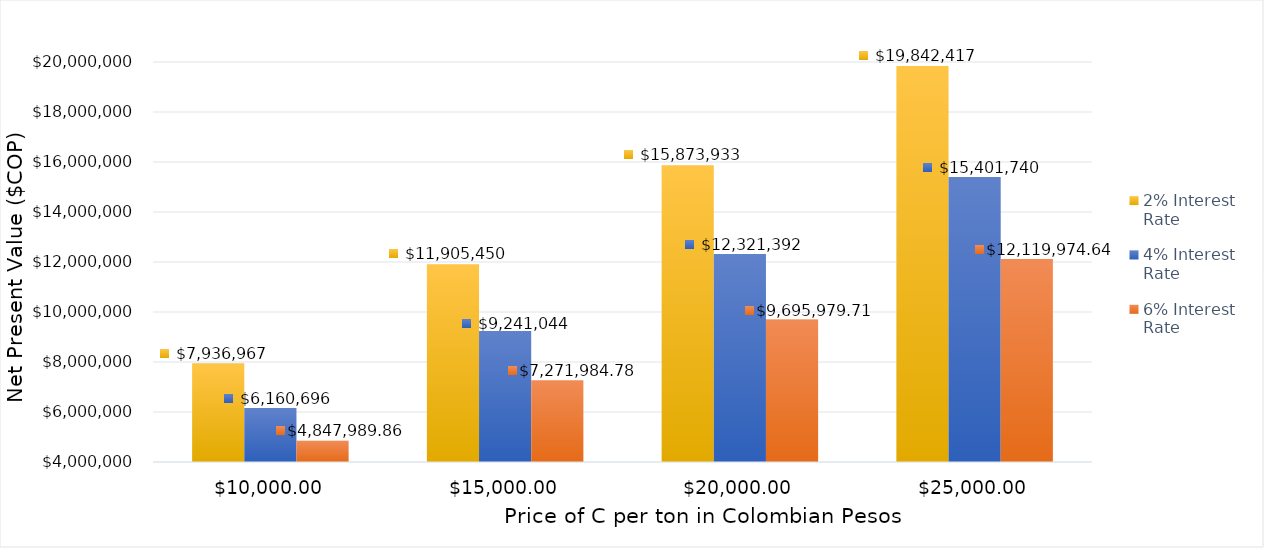
| Category | 2% Interest Rate | 4% Interest Rate | 6% Interest Rate |
|---|---|---|---|
| 10000.0 | 7936966.653 | 6160695.844 | 4847989.856 |
| 15000.0 | 11905449.98 | 9241043.766 | 7271984.784 |
| 20000.0 | 15873933.307 | 12321391.688 | 9695979.713 |
| 25000.0 | 19842416.63 | 15401739.61 | 12119974.641 |